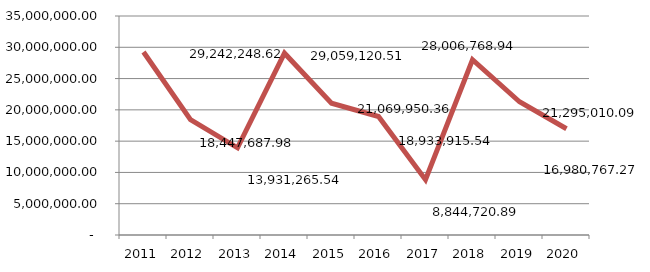
| Category | Valor dos contratos |
|---|---|
| 2011.0 | 29242248.62 |
| 2012.0 | 18447687.98 |
| 2013.0 | 13931265.54 |
| 2014.0 | 29059120.51 |
| 2015.0 | 21069950.36 |
| 2016.0 | 18933915.54 |
| 2017.0 | 8844720.89 |
| 2018.0 | 28006768.94 |
| 2019.0 | 21295010.09 |
| 2020.0 | 16980767.27 |